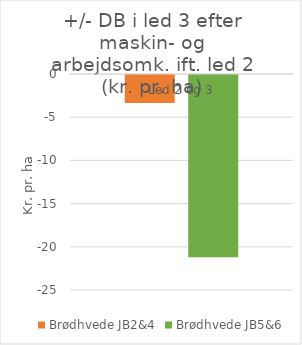
| Category | Brødhvede |  Brødhvede JB2&4  |  Brødhvede JB5&6  |
|---|---|---|---|
| Led 2 og 3 |  | -3.25 | -21.1 |